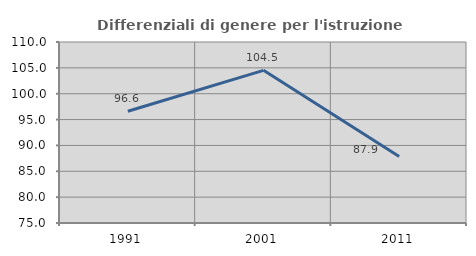
| Category | Differenziali di genere per l'istruzione superiore |
|---|---|
| 1991.0 | 96.604 |
| 2001.0 | 104.522 |
| 2011.0 | 87.874 |